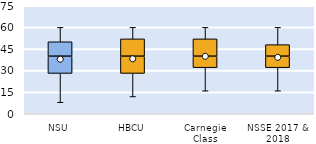
| Category | 25th | 50th | 75th |
|---|---|---|---|
| NSU | 28 | 12 | 10 |
| HBCU | 28 | 12 | 12 |
| Carnegie Class | 32 | 8 | 12 |
| NSSE 2017 & 2018 | 32 | 8 | 8 |